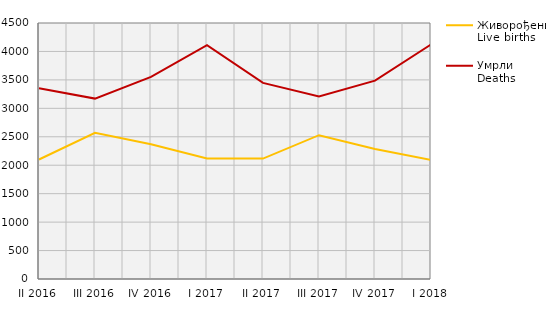
| Category | Живорођени
Live births | Умрли
Deaths |
|---|---|---|
| II 2016 | 2101 | 3353 |
| III 2016 | 2570 | 3171 |
| IV 2016 | 2369 | 3552 |
| I 2017 | 2118 | 4111 |
| II 2017 | 2116 | 3448 |
| III 2017 | 2528 | 3209 |
| IV 2017 | 2286 | 3486 |
| I 2018 | 2093 | 4123 |